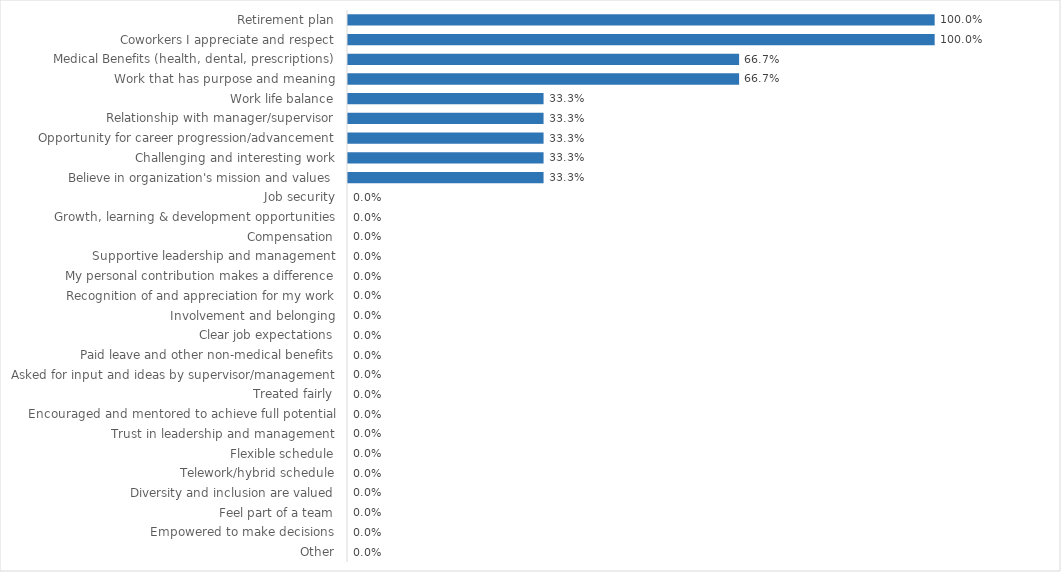
| Category | Criminal Justice Council |
|---|---|
| Retirement plan | 1 |
| Coworkers I appreciate and respect | 1 |
| Medical Benefits (health, dental, prescriptions) | 0.667 |
| Work that has purpose and meaning | 0.667 |
| Work life balance | 0.333 |
| Relationship with manager/supervisor | 0.333 |
| Opportunity for career progression/advancement | 0.333 |
| Challenging and interesting work | 0.333 |
| Believe in organization's mission and values | 0.333 |
| Job security | 0 |
| Growth, learning & development opportunities | 0 |
| Compensation | 0 |
| Supportive leadership and management | 0 |
| My personal contribution makes a difference | 0 |
| Recognition of and appreciation for my work | 0 |
| Involvement and belonging | 0 |
| Clear job expectations | 0 |
| Paid leave and other non-medical benefits | 0 |
| Asked for input and ideas by supervisor/management | 0 |
| Treated fairly | 0 |
| Encouraged and mentored to achieve full potential | 0 |
| Trust in leadership and management | 0 |
| Flexible schedule | 0 |
| Telework/hybrid schedule | 0 |
| Diversity and inclusion are valued | 0 |
| Feel part of a team | 0 |
| Empowered to make decisions | 0 |
| Other | 0 |